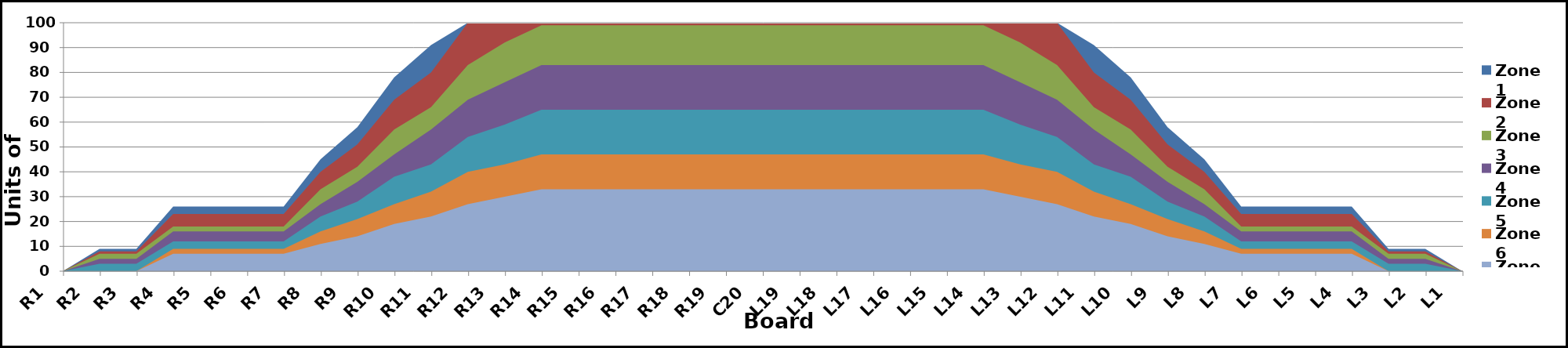
| Category | Zone 1 | Zone 2 | Zone 3 | Zone 4 | Zone 5 | Zone 6 | Zone 7 | Zone 8 |
|---|---|---|---|---|---|---|---|---|
| L1 | 0 | 0 | 0 | 0 | 0 | 0 | 0 | 0 |
| L2 | 9 | 8 | 7 | 5 | 3 | 0 | 0 | 0 |
| L3 | 9 | 8 | 7 | 5 | 3 | 0 | 0 | 0 |
| L4 | 26 | 23 | 18 | 16 | 12 | 9 | 7 | 0 |
| L5 | 26 | 23 | 18 | 16 | 12 | 9 | 7 | 0 |
| L6 | 26 | 23 | 18 | 16 | 12 | 9 | 7 | 0 |
| L7 | 26 | 23 | 18 | 16 | 12 | 9 | 7 | 0 |
| L8 | 45 | 40 | 33 | 27 | 22 | 16 | 11 | 0 |
| L9 | 58 | 51 | 42 | 36 | 28 | 21 | 14 | 0 |
| L10 | 78 | 69 | 57 | 47 | 38 | 27 | 19 | 0 |
| L11 | 91 | 80 | 66 | 57 | 43 | 32 | 22 | 0 |
| L12 | 100 | 100 | 83 | 69 | 54 | 40 | 27 | 0 |
| L13 | 100 | 100 | 92 | 76 | 59 | 43 | 30 | 0 |
| L14 | 100 | 100 | 99 | 83 | 65 | 47 | 33 | 0 |
| L15 | 100 | 100 | 99 | 83 | 65 | 47 | 33 | 0 |
| L16 | 100 | 100 | 99 | 83 | 65 | 47 | 33 | 0 |
| L17 | 100 | 100 | 99 | 83 | 65 | 47 | 33 | 0 |
| L18 | 100 | 100 | 99 | 83 | 65 | 47 | 33 | 0 |
| L19 | 100 | 100 | 99 | 83 | 65 | 47 | 33 | 0 |
| C20 | 100 | 100 | 99 | 83 | 65 | 47 | 33 | 0 |
| R19 | 100 | 100 | 99 | 83 | 65 | 47 | 33 | 0 |
| R18 | 100 | 100 | 99 | 83 | 65 | 47 | 33 | 0 |
| R17 | 100 | 100 | 99 | 83 | 65 | 47 | 33 | 0 |
| R16 | 100 | 100 | 99 | 83 | 65 | 47 | 33 | 0 |
| R15 | 100 | 100 | 99 | 83 | 65 | 47 | 33 | 0 |
| R14 | 100 | 100 | 99 | 83 | 65 | 47 | 33 | 0 |
| R13 | 100 | 100 | 92 | 76 | 59 | 43 | 30 | 0 |
| R12 | 100 | 100 | 83 | 69 | 54 | 40 | 27 | 0 |
| R11 | 91 | 80 | 66 | 57 | 43 | 32 | 22 | 0 |
| R10 | 78 | 69 | 57 | 47 | 38 | 27 | 19 | 0 |
| R9 | 58 | 51 | 42 | 36 | 28 | 21 | 14 | 0 |
| R8 | 45 | 40 | 33 | 27 | 22 | 16 | 11 | 0 |
| R7 | 26 | 23 | 18 | 16 | 12 | 9 | 7 | 0 |
| R6 | 26 | 23 | 18 | 16 | 12 | 9 | 7 | 0 |
| R5 | 26 | 23 | 18 | 16 | 12 | 9 | 7 | 0 |
| R4 | 26 | 23 | 18 | 16 | 12 | 9 | 7 | 0 |
| R3 | 9 | 8 | 7 | 5 | 3 | 0 | 0 | 0 |
| R2 | 9 | 8 | 7 | 5 | 3 | 0 | 0 | 0 |
| R1 | 0 | 0 | 0 | 0 | 0 | 0 | 0 | 0 |